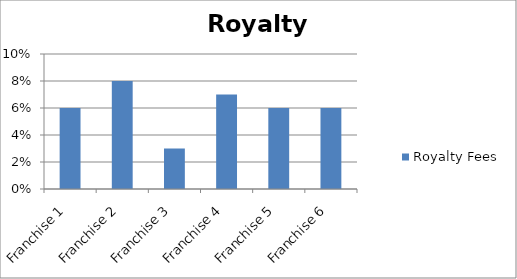
| Category | Royalty Fees |
|---|---|
| Franchise 1 | 0.06 |
| Franchise 2 | 0.08 |
| Franchise 3 | 0.03 |
| Franchise 4 | 0.07 |
| Franchise 5 | 0.06 |
| Franchise 6 | 0.06 |